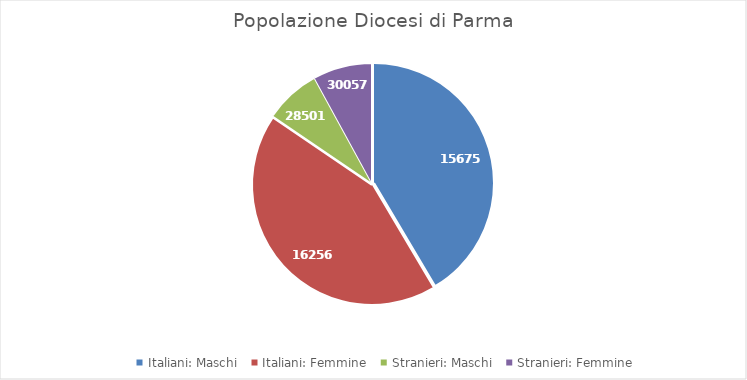
| Category | Series 0 |
|---|---|
| Italiani: Maschi | 156755 |
| Italiani: Femmine | 162565 |
| Stranieri: Maschi | 28501 |
| Stranieri: Femmine | 30057 |